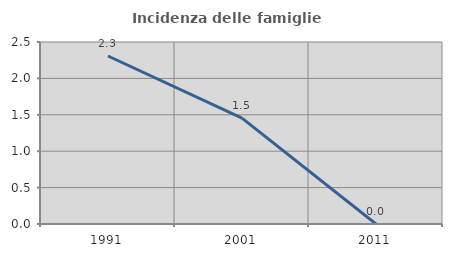
| Category | Incidenza delle famiglie numerose |
|---|---|
| 1991.0 | 2.308 |
| 2001.0 | 1.455 |
| 2011.0 | 0 |